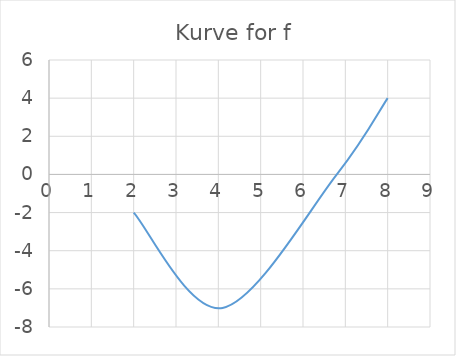
| Category | Series 0 |
|---|---|
| 2.0 | -2 |
| 4.1 | -7 |
| 6.8 | 0 |
| 8.0 | 4 |